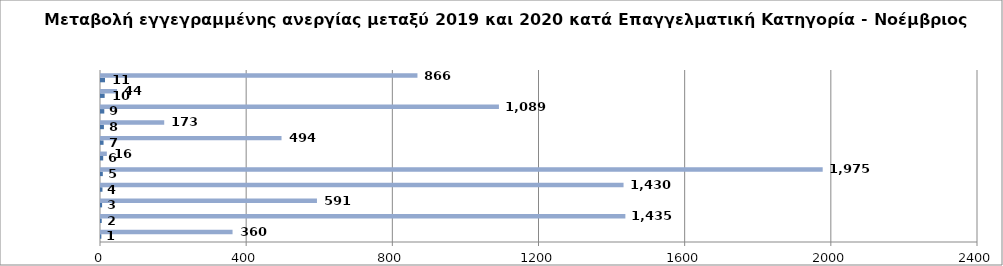
| Category | Series 0 | Series 1 |
|---|---|---|
| 0 | 1 | 360 |
| 1 | 2 | 1435 |
| 2 | 3 | 591 |
| 3 | 4 | 1430 |
| 4 | 5 | 1975 |
| 5 | 6 | 16 |
| 6 | 7 | 494 |
| 7 | 8 | 173 |
| 8 | 9 | 1089 |
| 9 | 10 | 44 |
| 10 | 11 | 866 |